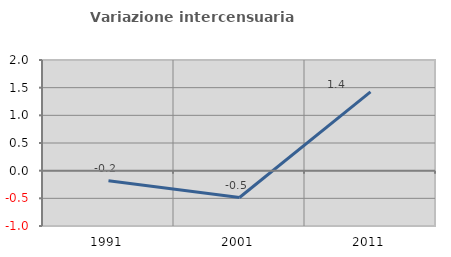
| Category | Variazione intercensuaria annua |
|---|---|
| 1991.0 | -0.182 |
| 2001.0 | -0.486 |
| 2011.0 | 1.424 |